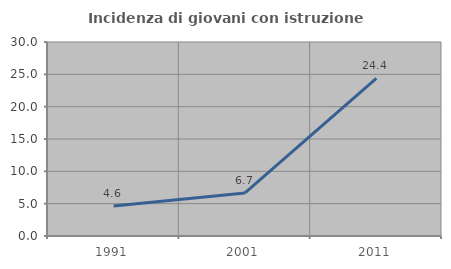
| Category | Incidenza di giovani con istruzione universitaria |
|---|---|
| 1991.0 | 4.63 |
| 2001.0 | 6.667 |
| 2011.0 | 24.359 |